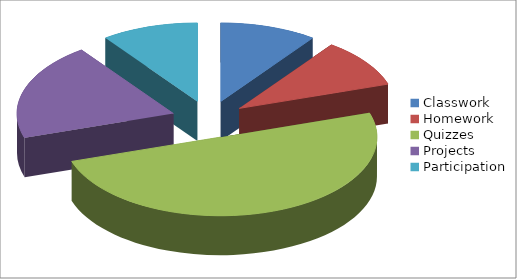
| Category | Series 0 |
|---|---|
| Classwork | 10 |
| Homework | 10 |
| Quizzes | 50 |
| Projects | 20 |
| Participation | 10 |